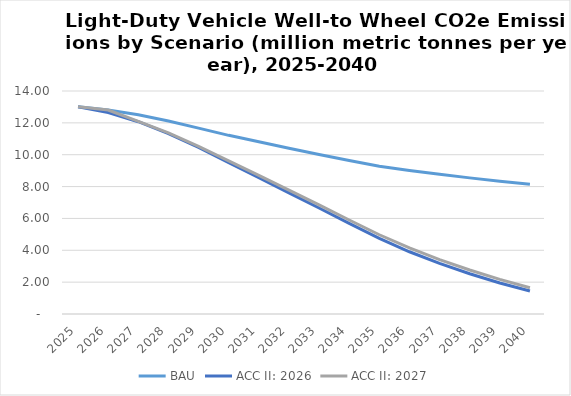
| Category | BAU | ACC II: 2026 | ACC II: 2027 |
|---|---|---|---|
| 2025.0 | 13.005 | 13.005 | 13.005 |
| 2026.0 | 12.805 | 12.645 | 12.805 |
| 2027.0 | 12.509 | 12.073 | 12.088 |
| 2028.0 | 12.122 | 11.328 | 11.372 |
| 2029.0 | 11.671 | 10.453 | 10.529 |
| 2030.0 | 11.216 | 9.505 | 9.614 |
| 2031.0 | 10.81 | 8.566 | 8.707 |
| 2032.0 | 10.405 | 7.603 | 7.774 |
| 2033.0 | 10.014 | 6.653 | 6.849 |
| 2034.0 | 9.637 | 5.687 | 5.903 |
| 2035.0 | 9.281 | 4.743 | 4.975 |
| 2036.0 | 9.016 | 3.908 | 4.148 |
| 2037.0 | 8.771 | 3.175 | 3.416 |
| 2038.0 | 8.546 | 2.525 | 2.76 |
| 2039.0 | 8.339 | 1.949 | 2.172 |
| 2040.0 | 8.15 | 1.444 | 1.646 |